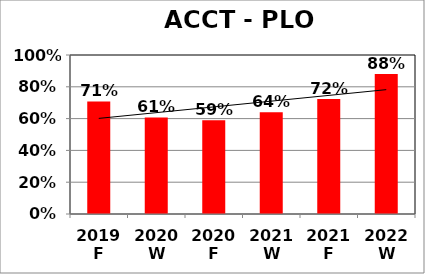
| Category | Series 0 |
|---|---|
| 2019 F | 0.708 |
| 2020 W | 0.607 |
| 2020 F | 0.59 |
| 2021 W | 0.64 |
| 2021 F | 0.724 |
| 2022 W | 0.881 |